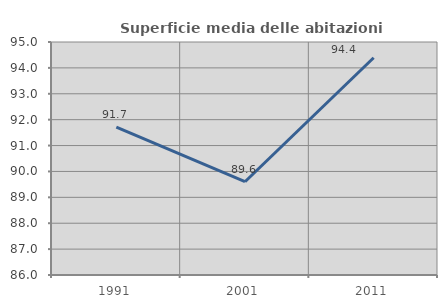
| Category | Superficie media delle abitazioni occupate |
|---|---|
| 1991.0 | 91.716 |
| 2001.0 | 89.603 |
| 2011.0 | 94.391 |